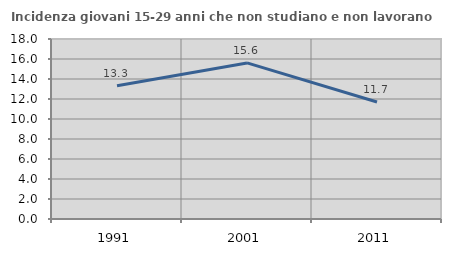
| Category | Incidenza giovani 15-29 anni che non studiano e non lavorano  |
|---|---|
| 1991.0 | 13.325 |
| 2001.0 | 15.607 |
| 2011.0 | 11.696 |